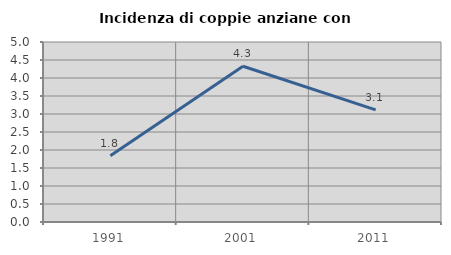
| Category | Incidenza di coppie anziane con figli |
|---|---|
| 1991.0 | 1.84 |
| 2001.0 | 4.327 |
| 2011.0 | 3.113 |